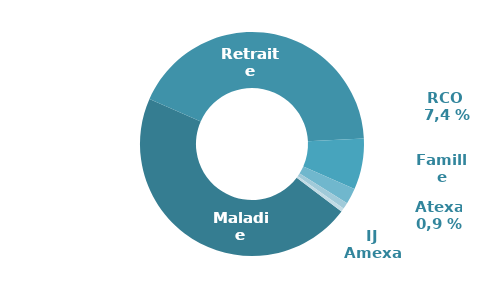
| Category | Series 0 |
|---|---|
| ü retraite | 0.463 |
| ü maladie-maternité-invalidité | 0.426 |
| ü retraite complémentaire obligatoire | 0.074 |
| ü famille | 0.023 |
| ü accident du travail et maladie professionnelle | 0.009 |
| ü IJ AMEXA | 0.005 |